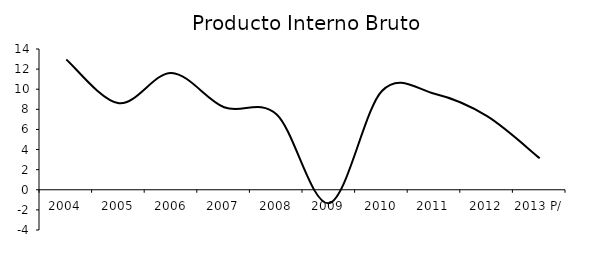
| Category | Producto Interno Bruto a precios de mercado  |
|---|---|
| 2004 | 12.963 |
| 2005 | 8.606 |
| 2006 | 11.617 |
| 2007 | 8.21 |
| 2008 | 7.486 |
| 2009 | -1.33 |
| 2010 | 9.825 |
| 2011 | 9.546 |
| 2012 | 7.32 |
| 2013 P/ | 3.134 |